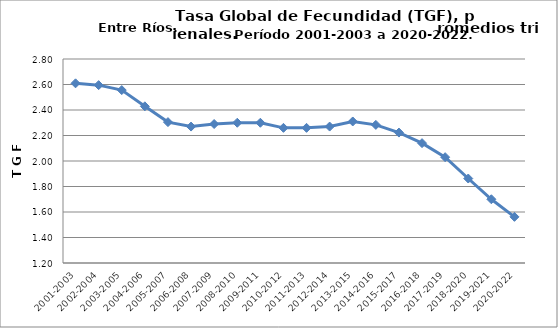
| Category | Series 0 |
|---|---|
| 2001-2003 | 2.609 |
| 2002-2004 | 2.595 |
| 2003-2005 | 2.556 |
| 2004-2006 | 2.429 |
| 2005-2007 | 2.305 |
| 2006-2008 | 2.27 |
| 2007-2009 | 2.29 |
| 2008-2010 | 2.3 |
| 2009-2011 | 2.3 |
| 2010-2012 | 2.26 |
| 2011-2013 | 2.26 |
| 2012-2014 | 2.27 |
| 2013-2015 | 2.31 |
| 2014-2016 | 2.283 |
| 2015-2017 | 2.223 |
| 2016-2018 | 2.14 |
| 2017-2019 | 2.03 |
| 2018-2020 | 1.863 |
| 2019-2021 | 1.7 |
| 2020-2022 | 1.562 |